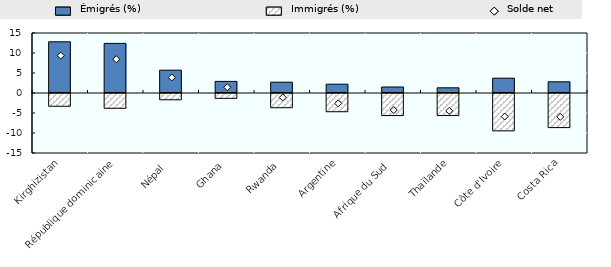
| Category | Émigrés (%) | Immigrés (%) |
|---|---|---|
| Kirghizistan | 12.8 | -3.441 |
| République dominicaine | 12.4 | -3.947 |
| Népal  | 5.7 | -1.818 |
| Ghana | 2.9 | -1.457 |
| Rwanda | 2.7 | -3.803 |
| Argentine | 2.2 | -4.805 |
| Afrique du Sud | 1.5 | -5.767 |
| Thaïlande | 1.3 | -5.758 |
| Côte d'Ivoire | 3.7 | -9.583 |
| Costa Rica | 2.8 | -8.771 |